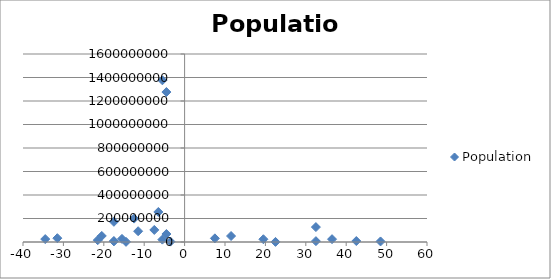
| Category | Population |
|---|---|
| 36.5 | 24104700 |
| -17.5 | 171700000 |
| 22.5 | 742737 |
| -21.5 | 15458332 |
| 32.5 | 7234800 |
| -4.5 | 1276267000 |
| -6.5 | 255461700 |
| 32.5 | 126919659 |
| -34.5 | 24895000 |
| 11.5 | 50801405 |
| -17.5 | 6803699 |
| 7.5 | 31068000 |
| -3.5 | 3081677 |
| -20.5 | 51486253 |
| -15.5 | 26494504 |
| 48.5 | 4691480 |
| -12.5 | 199085847 |
| -17.5 | 7059653 |
| -7.5 | 102580000 |
| 42.5 | 8211700 |
| -5.5 | 20277597 |
| 19.5 | 23476640 |
| -4.5 | 67959000 |
| -14.5 | 1201542 |
| -11.5 | 91700000 |
| -5.5 | 1376049000 |
| -31.5 | 32564342 |